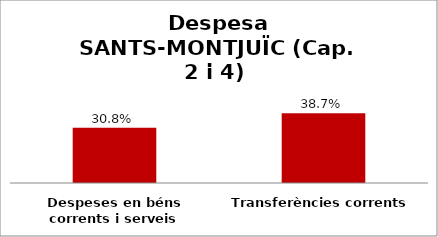
| Category | Series 0 |
|---|---|
| Despeses en béns corrents i serveis | 0.308 |
| Transferències corrents | 0.387 |